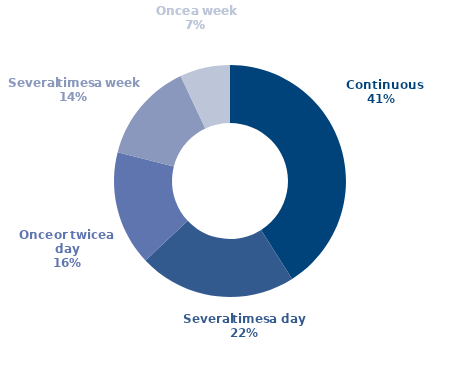
| Category | Series 0 |
|---|---|
| 0 | 41 |
| 1 | 22 |
| 2 | 16 |
| 3 | 14 |
| 4 | 7 |